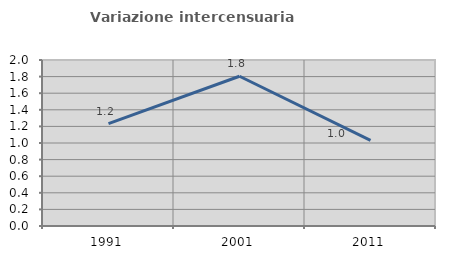
| Category | Variazione intercensuaria annua |
|---|---|
| 1991.0 | 1.234 |
| 2001.0 | 1.804 |
| 2011.0 | 1.033 |